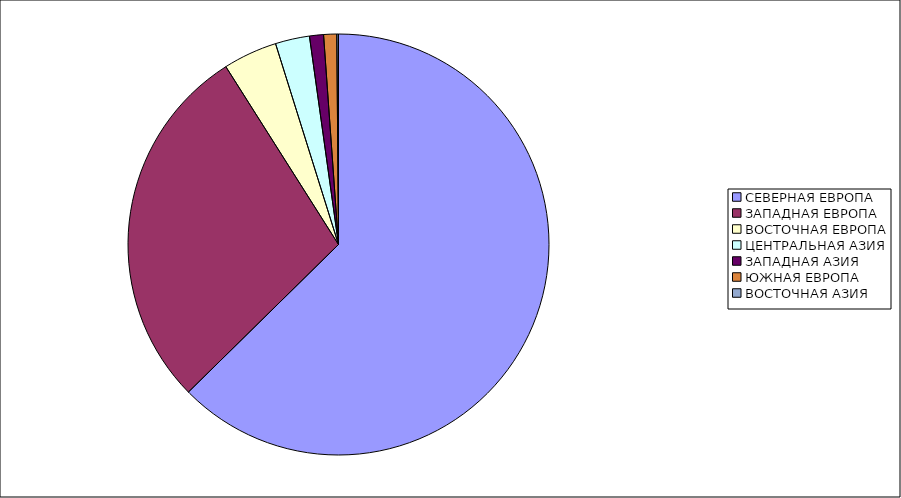
| Category | Оборот |
|---|---|
| СЕВЕРНАЯ ЕВРОПА | 62.634 |
| ЗАПАДНАЯ ЕВРОПА | 28.377 |
| ВОСТОЧНАЯ ЕВРОПА | 4.154 |
| ЦЕНТРАЛЬНАЯ АЗИЯ | 2.627 |
| ЗАПАДНАЯ АЗИЯ | 1.076 |
| ЮЖНАЯ ЕВРОПА | 1.003 |
| ВОСТОЧНАЯ АЗИЯ | 0.129 |